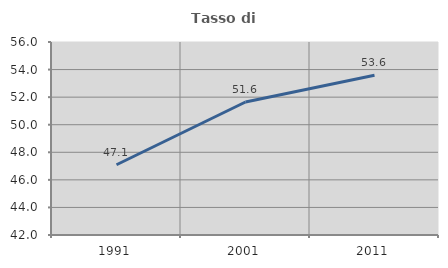
| Category | Tasso di occupazione   |
|---|---|
| 1991.0 | 47.096 |
| 2001.0 | 51.649 |
| 2011.0 | 53.592 |